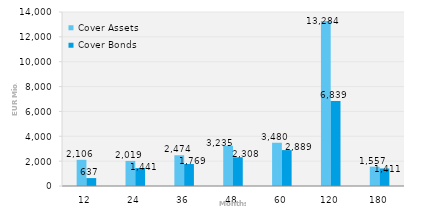
| Category | Cover Assets | Cover Bonds |
|---|---|---|
| 12.0 | 2106.29 | 637.13 |
| 24.0 | 2018.99 | 1441.2 |
| 36.0 | 2474.36 | 1769 |
| 48.0 | 3235.1 | 2308 |
| 60.0 | 3480.45 | 2888.5 |
| 120.0 | 13283.66 | 6839 |
| 180.0 | 1556.8 | 1411 |